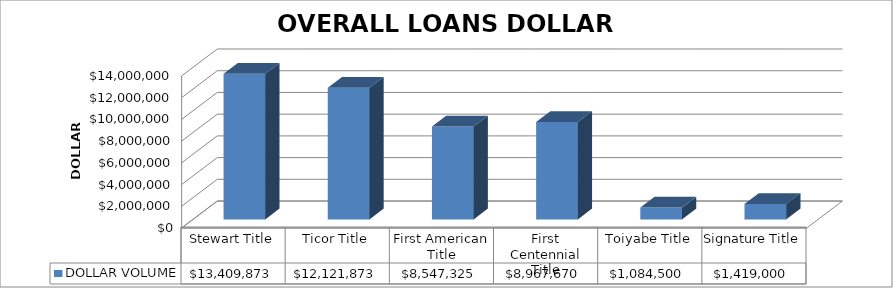
| Category | DOLLAR VOLUME |
|---|---|
| Stewart Title | 13409873 |
| Ticor Title | 12121873 |
| First American Title | 8547325 |
| First Centennial Title | 8967670 |
| Toiyabe Title | 1084500 |
| Signature Title | 1419000 |